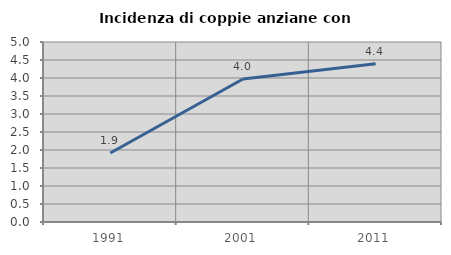
| Category | Incidenza di coppie anziane con figli |
|---|---|
| 1991.0 | 1.917 |
| 2001.0 | 3.974 |
| 2011.0 | 4.394 |